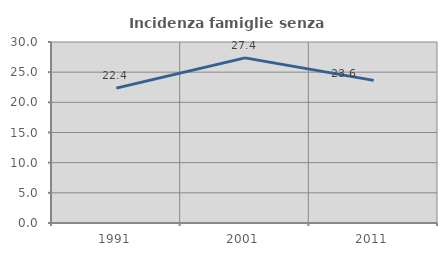
| Category | Incidenza famiglie senza nuclei |
|---|---|
| 1991.0 | 22.36 |
| 2001.0 | 27.368 |
| 2011.0 | 23.636 |